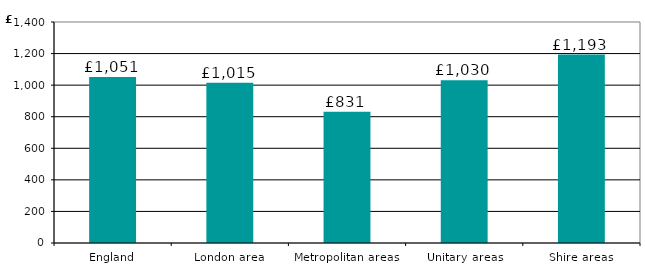
| Category | Series 0 |
|---|---|
| England | 1051.35 |
| London area | 1014.51 |
| Metropolitan areas | 830.66 |
| Unitary areas | 1030.36 |
| Shire areas | 1193.44 |